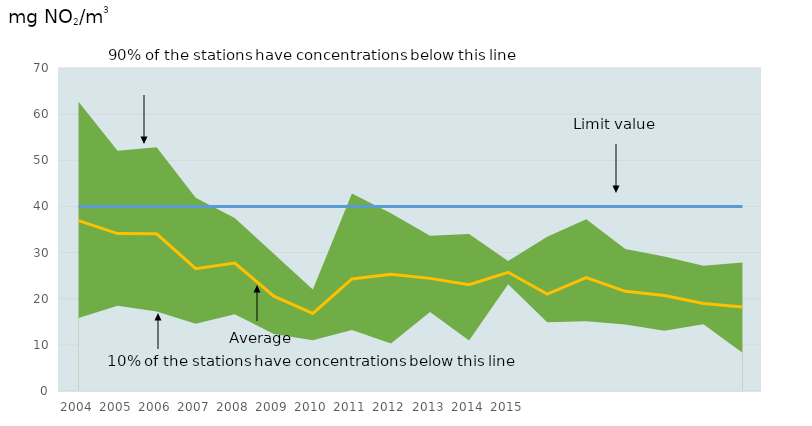
| Category | LV | average |
|---|---|---|
| 2004.0 | 40 | 36.922 |
| 2005.0 | 40 | 34.113 |
| 2006.0 | 40 | 34.068 |
| 2007.0 | 40 | 26.514 |
| 2008.0 | 40 | 27.713 |
| 2009.0 | 40 | 20.545 |
| 2010.0 | 40 | 16.818 |
| 2011.0 | 40 | 24.286 |
| 2012.0 | 40 | 25.326 |
| 2013.0 | 40 | 24.407 |
| 2014.0 | 40 | 23.054 |
| 2015.0 | 40 | 25.722 |
| 2016.0 | 40 | 21 |
| 2017.0 | 40 | 24.564 |
| 2018.0 | 40 | 21.607 |
| 2019.0 | 40 | 20.695 |
| 2020.0 | 40 | 18.983 |
| 2021.0 | 40 | 18.181 |